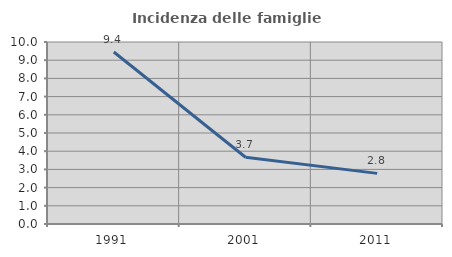
| Category | Incidenza delle famiglie numerose |
|---|---|
| 1991.0 | 9.45 |
| 2001.0 | 3.67 |
| 2011.0 | 2.781 |